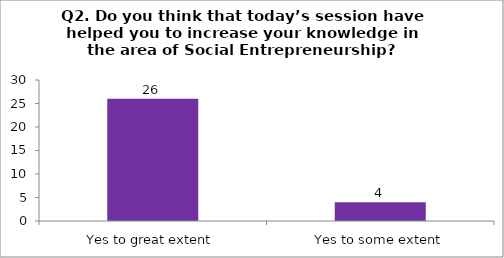
| Category | Q2. Do you think that today’s session have helped you to increase your knowledge in the area of Social Entrepreneurship? |
|---|---|
| Yes to great extent | 26 |
| Yes to some extent | 4 |